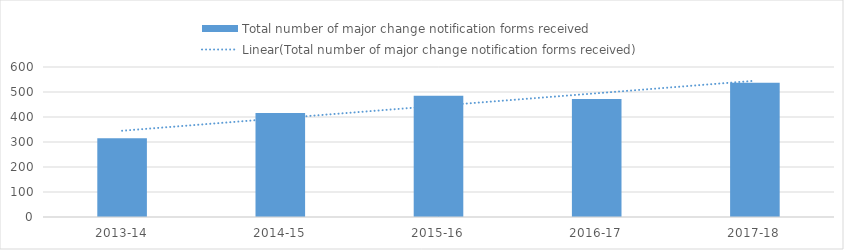
| Category | Total number of major change notification forms received |
|---|---|
| 2013-14 | 315 |
| 2014-15 | 416 |
| 2015-16 | 485 |
| 2016-17 | 472 |
| 2017-18 | 537 |